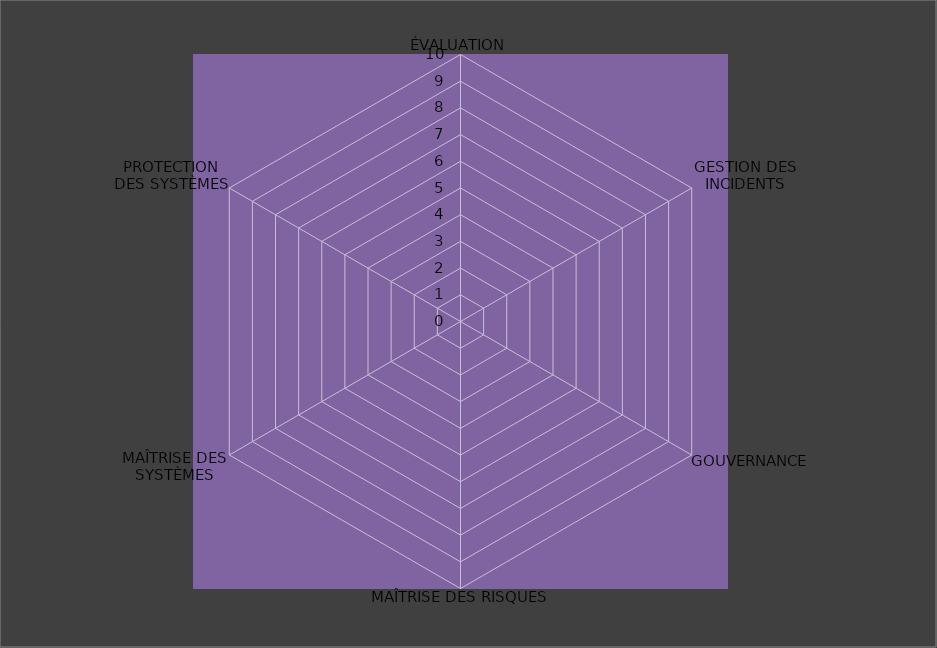
| Category | Année 2029 |
|---|---|
| ÉVALUATION | 0 |
| GESTION DES INCIDENTS | 0 |
| GOUVERNANCE | 0 |
| MAÎTRISE DES RISQUES | 0 |
| MAÎTRISE DES SYSTÈMES | 0 |
| PROTECTION
DES SYSTÈMES | 0 |